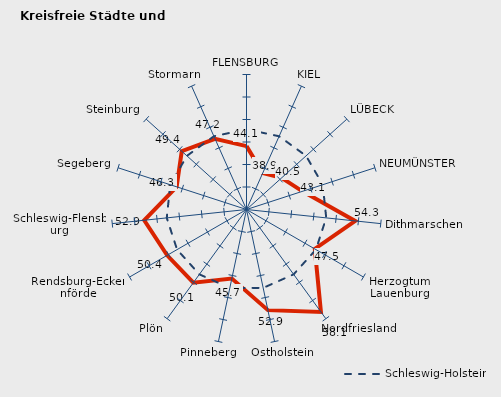
| Category | Kreise | Schleswig-Holstein |
|---|---|---|
| FLENSBURG | 44.081 | 47.815 |
| KIEL | 38.885 | 47.815 |
| LÜBECK | 40.499 | 47.815 |
| NEUMÜNSTER | 43.081 | 47.815 |
| Dithmarschen | 54.289 | 47.815 |
| Herzogtum Lauenburg | 47.526 | 47.815 |
| Nordfriesland | 58.14 | 47.815 |
| Ostholstein | 52.863 | 47.815 |
| Pinneberg | 45.683 | 47.815 |
| Plön | 50.105 | 47.815 |
| Rendsburg-Eckernförde | 50.357 | 47.815 |
| Schleswig-Flensburg | 52.852 | 47.815 |
| Segeberg | 46.322 | 47.815 |
| Steinburg | 49.359 | 47.815 |
| Stormarn | 47.207 | 47.815 |